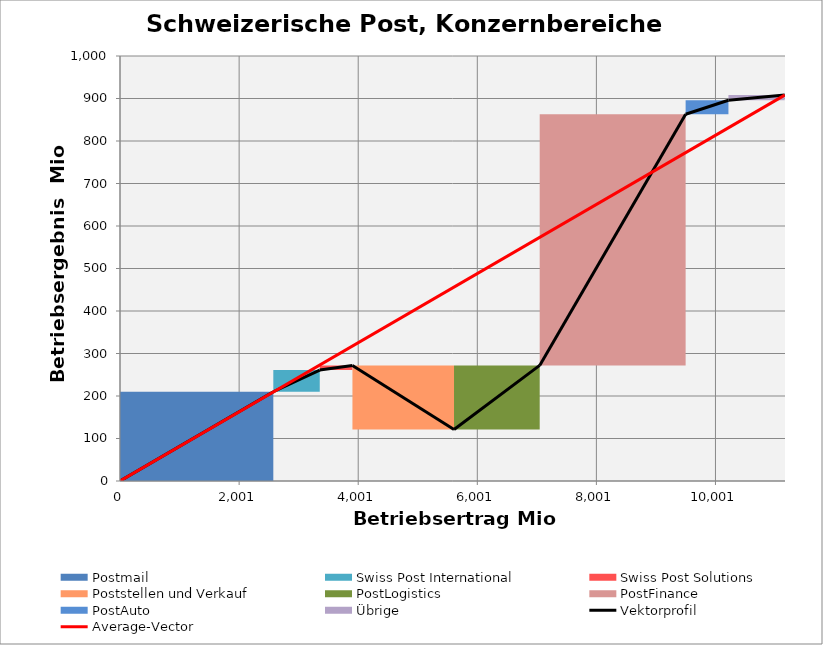
| Category | transparent | Postmail | Swiss Post International | Swiss Post Solutions | Poststellen und Verkauf | PostLogistics | PostFinance | PostAuto | Übrige | Border right & top |
|---|---|---|---|---|---|---|---|---|---|---|
| 0.0 | 0 | 210 | 0 | 0 | 0 | 0 | 0 | 0 | 0 | 0 |
| 2575.0 | 0 | 210 | 0 | 0 | 0 | 0 | 0 | 0 | 0 | 0 |
| 2575.0 | 210 | 0 | 51 | 0 | 0 | 0 | 0 | 0 | 0 | 0 |
| 3355.0 | 210 | 0 | 51 | 0 | 0 | 0 | 0 | 0 | 0 | 0 |
| 3355.0 | 261 | 0 | 0 | 11 | 0 | 0 | 0 | 0 | 0 | 0 |
| 3904.0 | 261 | 0 | 0 | 11 | 0 | 0 | 0 | 0 | 0 | 0 |
| 3904.0 | 272 | 0 | 0 | 0 | -151 | 0 | 0 | 0 | 0 | 0 |
| 5610.0 | 272 | 0 | 0 | 0 | -151 | 0 | 0 | 0 | 0 | 0 |
| 5610.0 | 121 | 0 | 0 | 0 | 0 | 151 | 0 | 0 | 0 | 0 |
| 7049.0 | 121 | 0 | 0 | 0 | 0 | 151 | 0 | 0 | 0 | 0 |
| 7049.0 | 272 | 0 | 0 | 0 | 0 | 0 | 591 | 0 | 0 | 0 |
| 9500.0 | 272 | 0 | 0 | 0 | 0 | 0 | 591 | 0 | 0 | 0 |
| 9500.0 | 863 | 0 | 0 | 0 | 0 | 0 | 0 | 33 | 0 | 0 |
| 10219.0 | 863 | 0 | 0 | 0 | 0 | 0 | 0 | 33 | 0 | 0 |
| 10219.0 | 896 | 0 | 0 | 0 | 0 | 0 | 0 | 0 | 12 | 0 |
| 11164.0 | 896 | 0 | 0 | 0 | 0 | 0 | 0 | 0 | 12 | 0 |
| 11164.0 | 908 | 0 | 0 | 0 | 0 | 0 | 0 | 0 | 0 | 0 |
| 11164.0 | 908 | 0 | 0 | 0 | 0 | 0 | 0 | 0 | 0 | 0 |
| 11164.0 | 908 | 0 | 0 | 0 | 0 | 0 | 0 | 0 | 0 | 0 |
| 11164.0 | 908 | 0 | 0 | 0 | 0 | 0 | 0 | 0 | 0 | 0 |
| 11164.0 | 908 | 0 | 0 | 0 | 0 | 0 | 0 | 0 | 0 | 0 |
| 11169.0 | 908 | 0 | 0 | 0 | 0 | 0 | 0 | 0 | 0 | 0 |
| 11169.0 | 908 | 0 | 0 | 0 | 0 | 0 | 0 | 0 | 0 | 0 |